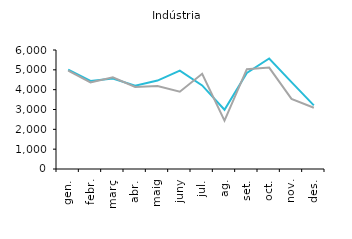
| Category | 2018 | 2019 |
|---|---|---|
| gen. | 5006 | 4957 |
| febr. | 4442 | 4362 |
| març | 4563 | 4620 |
| abr. | 4196 | 4136 |
| maig | 4459 | 4183 |
| juny | 4963 | 3896 |
| jul. | 4215 | 4804 |
| ag. | 2985 | 2442 |
| set. | 4847 | 5032 |
| oct. | 5570 | 5114 |
| nov. | 4381 | 3534 |
| des. | 3209 | 3091 |